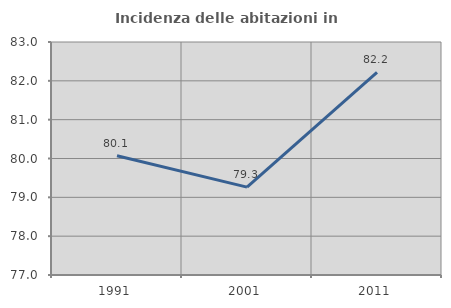
| Category | Incidenza delle abitazioni in proprietà  |
|---|---|
| 1991.0 | 80.069 |
| 2001.0 | 79.264 |
| 2011.0 | 82.219 |